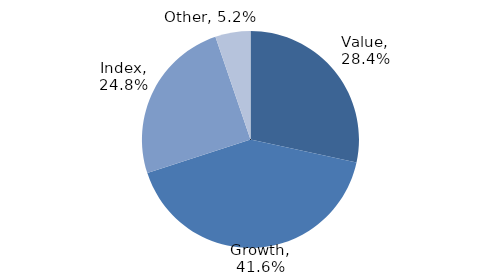
| Category | Investment Style |
|---|---|
| Value | 0.284 |
| Growth | 0.416 |
| Index | 0.248 |
| Other | 0.052 |